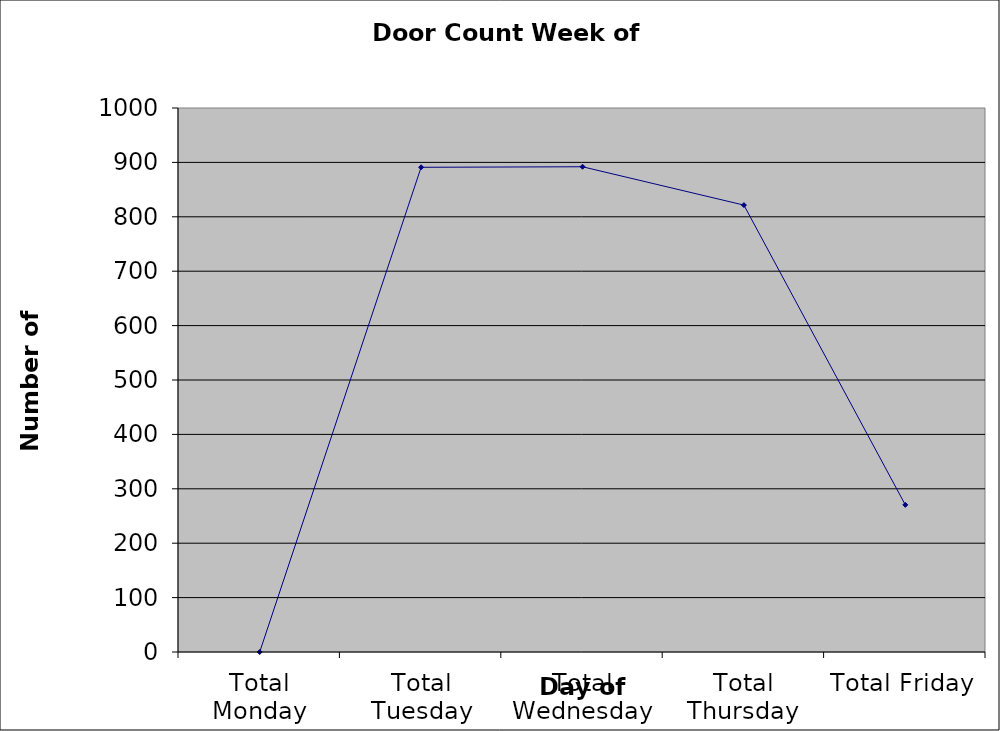
| Category | Series 0 |
|---|---|
| Total Monday | 0 |
| Total Tuesday | 891 |
| Total Wednesday | 892 |
| Total Thursday | 821.5 |
| Total Friday | 270.5 |